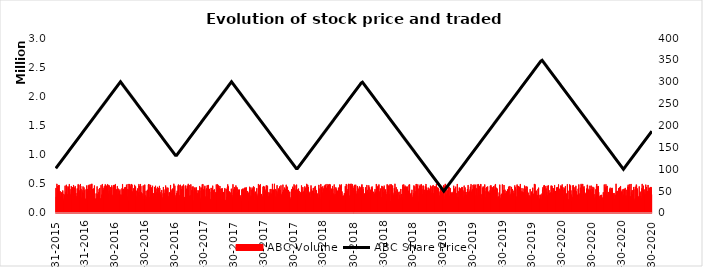
| Category | ABC Volume |
|---|---|
| 2020-12-31 | 293593 |
| 2020-12-30 | 274828 |
| 2020-12-29 | 272429 |
| 2020-12-28 | 317765 |
| 2020-12-27 | 442030 |
| 2020-12-26 | 394762 |
| 2020-12-25 | 220934 |
| 2020-12-24 | 445362 |
| 2020-12-23 | 430547 |
| 2020-12-22 | 373317 |
| 2020-12-21 | 355032 |
| 2020-12-20 | 428271 |
| 2020-12-19 | 380629 |
| 2020-12-18 | 320092 |
| 2020-12-17 | 479339 |
| 2020-12-16 | 374862 |
| 2020-12-15 | 371770 |
| 2020-12-14 | 362038 |
| 2020-12-13 | 247561 |
| 2020-12-12 | 444840 |
| 2020-12-11 | 328514 |
| 2020-12-10 | 485592 |
| 2020-12-09 | 326918 |
| 2020-12-08 | 230145 |
| 2020-12-07 | 350394 |
| 2020-12-06 | 320505 |
| 2020-12-05 | 402558 |
| 2020-12-04 | 400434 |
| 2020-12-03 | 467513 |
| 2020-12-02 | 319006 |
| 2020-12-01 | 408041 |
| 2020-11-30 | 320580 |
| 2020-11-29 | 497994 |
| 2020-11-28 | 423713 |
| 2020-11-27 | 258534 |
| 2020-11-26 | 204472 |
| 2020-11-25 | 286640 |
| 2020-11-24 | 234676 |
| 2020-11-23 | 364799 |
| 2020-11-22 | 340501 |
| 2020-11-21 | 227090 |
| 2020-11-20 | 454773 |
| 2020-11-19 | 287792 |
| 2020-11-18 | 272319 |
| 2020-11-17 | 215284 |
| 2020-11-16 | 248595 |
| 2020-11-15 | 391446 |
| 2020-11-14 | 419872 |
| 2020-11-13 | 347623 |
| 2020-11-12 | 475733 |
| 2020-11-11 | 486680 |
| 2020-11-10 | 225499 |
| 2020-11-09 | 252425 |
| 2020-11-08 | 449818 |
| 2020-11-07 | 245197 |
| 2020-11-06 | 205744 |
| 2020-11-05 | 217034 |
| 2020-11-04 | 402614 |
| 2020-11-03 | 445328 |
| 2020-11-02 | 247998 |
| 2020-11-01 | 388573 |
| 2020-10-31 | 321433 |
| 2020-10-30 | 235897 |
| 2020-10-29 | 390534 |
| 2020-10-28 | 248147 |
| 2020-10-27 | 352326 |
| 2020-10-26 | 497309 |
| 2020-10-25 | 202663 |
| 2020-10-24 | 282266 |
| 2020-10-23 | 284220 |
| 2020-10-22 | 491024 |
| 2020-10-21 | 267436 |
| 2020-10-20 | 387202 |
| 2020-10-19 | 445088 |
| 2020-10-18 | 302125 |
| 2020-10-17 | 483555 |
| 2020-10-16 | 449030 |
| 2020-10-15 | 358519 |
| 2020-10-14 | 261048 |
| 2020-10-13 | 397051 |
| 2020-10-12 | 212842 |
| 2020-10-11 | 298077 |
| 2020-10-10 | 291576 |
| 2020-10-09 | 207609 |
| 2020-10-08 | 429492 |
| 2020-10-07 | 398180 |
| 2020-10-06 | 330576 |
| 2020-10-05 | 402723 |
| 2020-10-04 | 412116 |
| 2020-10-03 | 296934 |
| 2020-10-02 | 315520 |
| 2020-10-01 | 280790 |
| 2020-09-30 | 243458 |
| 2020-09-29 | 402713 |
| 2020-09-28 | 363687 |
| 2020-09-27 | 207209 |
| 2020-09-26 | 367587 |
| 2020-09-25 | 266977 |
| 2020-09-24 | 460219 |
| 2020-09-23 | 220444 |
| 2020-09-22 | 439026 |
| 2020-09-21 | 435786 |
| 2020-09-20 | 418506 |
| 2020-09-19 | 293780 |
| 2020-09-18 | 425760 |
| 2020-09-17 | 281421 |
| 2020-09-16 | 339735 |
| 2020-09-15 | 378714 |
| 2020-09-14 | 213101 |
| 2020-09-13 | 342590 |
| 2020-09-12 | 222878 |
| 2020-09-11 | 368576 |
| 2020-09-10 | 499541 |
| 2020-09-09 | 305060 |
| 2020-09-08 | 240695 |
| 2020-09-07 | 313709 |
| 2020-09-06 | 222005 |
| 2020-09-05 | 244117 |
| 2020-09-04 | 341645 |
| 2020-09-03 | 338054 |
| 2020-09-02 | 272757 |
| 2020-09-01 | 312013 |
| 2020-08-31 | 273923 |
| 2020-08-30 | 387272 |
| 2020-08-29 | 430373 |
| 2020-08-28 | 424963 |
| 2020-08-27 | 237598 |
| 2020-08-26 | 395861 |
| 2020-08-25 | 304533 |
| 2020-08-24 | 353151 |
| 2020-08-23 | 433123 |
| 2020-08-22 | 412750 |
| 2020-08-21 | 353564 |
| 2020-08-20 | 289937 |
| 2020-08-19 | 305488 |
| 2020-08-18 | 354125 |
| 2020-08-17 | 358713 |
| 2020-08-16 | 219059 |
| 2020-08-15 | 299359 |
| 2020-08-14 | 463470 |
| 2020-08-13 | 225856 |
| 2020-08-12 | 335096 |
| 2020-08-11 | 452896 |
| 2020-08-10 | 490731 |
| 2020-08-09 | 380206 |
| 2020-08-08 | 422097 |
| 2020-08-07 | 440602 |
| 2020-08-06 | 279053 |
| 2020-08-05 | 487886 |
| 2020-08-04 | 232232 |
| 2020-08-03 | 278026 |
| 2020-08-02 | 354609 |
| 2020-08-01 | 220355 |
| 2020-07-31 | 247379 |
| 2020-07-30 | 264295 |
| 2020-07-29 | 221296 |
| 2020-07-28 | 308168 |
| 2020-07-27 | 310395 |
| 2020-07-26 | 305130 |
| 2020-07-25 | 297193 |
| 2020-07-24 | 249064 |
| 2020-07-23 | 296013 |
| 2020-07-22 | 243907 |
| 2020-07-21 | 235634 |
| 2020-07-20 | 283247 |
| 2020-07-19 | 357714 |
| 2020-07-18 | 458597 |
| 2020-07-17 | 455423 |
| 2020-07-16 | 330691 |
| 2020-07-15 | 292055 |
| 2020-07-14 | 454823 |
| 2020-07-13 | 496620 |
| 2020-07-12 | 458319 |
| 2020-07-11 | 299392 |
| 2020-07-10 | 405182 |
| 2020-07-09 | 275742 |
| 2020-07-08 | 264995 |
| 2020-07-07 | 248351 |
| 2020-07-06 | 206250 |
| 2020-07-05 | 321291 |
| 2020-07-04 | 435438 |
| 2020-07-03 | 268614 |
| 2020-07-02 | 384959 |
| 2020-07-01 | 448057 |
| 2020-06-30 | 241472 |
| 2020-06-29 | 411460 |
| 2020-06-28 | 322298 |
| 2020-06-27 | 268618 |
| 2020-06-26 | 468176 |
| 2020-06-25 | 364962 |
| 2020-06-24 | 386042 |
| 2020-06-23 | 403868 |
| 2020-06-22 | 465546 |
| 2020-06-21 | 325212 |
| 2020-06-20 | 387564 |
| 2020-06-19 | 396195 |
| 2020-06-18 | 262077 |
| 2020-06-17 | 394744 |
| 2020-06-16 | 416019 |
| 2020-06-15 | 472125 |
| 2020-06-14 | 482319 |
| 2020-06-13 | 371648 |
| 2020-06-12 | 417693 |
| 2020-06-11 | 293828 |
| 2020-06-10 | 347341 |
| 2020-06-09 | 328677 |
| 2020-06-08 | 276267 |
| 2020-06-07 | 219418 |
| 2020-06-06 | 302438 |
| 2020-06-05 | 408557 |
| 2020-06-04 | 457717 |
| 2020-06-03 | 439293 |
| 2020-06-02 | 443428 |
| 2020-06-01 | 315535 |
| 2020-05-31 | 497722 |
| 2020-05-30 | 266016 |
| 2020-05-29 | 295369 |
| 2020-05-28 | 275805 |
| 2020-05-27 | 479265 |
| 2020-05-26 | 498565 |
| 2020-05-25 | 392603 |
| 2020-05-24 | 433113 |
| 2020-05-23 | 340204 |
| 2020-05-22 | 321420 |
| 2020-05-21 | 237299 |
| 2020-05-20 | 228883 |
| 2020-05-19 | 488584 |
| 2020-05-18 | 429200 |
| 2020-05-17 | 412673 |
| 2020-05-16 | 292912 |
| 2020-05-15 | 312720 |
| 2020-05-14 | 253837 |
| 2020-05-13 | 290539 |
| 2020-05-12 | 353909 |
| 2020-05-11 | 375604 |
| 2020-05-10 | 465164 |
| 2020-05-09 | 353156 |
| 2020-05-08 | 401326 |
| 2020-05-07 | 441034 |
| 2020-05-06 | 387944 |
| 2020-05-05 | 227071 |
| 2020-05-04 | 373667 |
| 2020-05-03 | 436260 |
| 2020-05-02 | 475428 |
| 2020-05-01 | 471126 |
| 2020-04-30 | 267703 |
| 2020-04-29 | 206551 |
| 2020-04-28 | 278298 |
| 2020-04-27 | 216684 |
| 2020-04-26 | 315089 |
| 2020-04-25 | 386591 |
| 2020-04-24 | 470329 |
| 2020-04-23 | 219808 |
| 2020-04-22 | 417544 |
| 2020-04-21 | 490041 |
| 2020-04-20 | 208571 |
| 2020-04-19 | 220179 |
| 2020-04-18 | 227873 |
| 2020-04-17 | 230576 |
| 2020-04-16 | 378062 |
| 2020-04-15 | 386934 |
| 2020-04-14 | 491922 |
| 2020-04-13 | 239001 |
| 2020-04-12 | 256068 |
| 2020-04-11 | 331203 |
| 2020-04-10 | 256195 |
| 2020-04-09 | 342380 |
| 2020-04-08 | 460254 |
| 2020-04-07 | 249301 |
| 2020-04-06 | 256168 |
| 2020-04-05 | 409473 |
| 2020-04-04 | 432671 |
| 2020-04-03 | 313710 |
| 2020-04-02 | 295084 |
| 2020-04-01 | 394463 |
| 2020-03-31 | 445649 |
| 2020-03-30 | 203758 |
| 2020-03-29 | 488651 |
| 2020-03-28 | 402739 |
| 2020-03-27 | 455798 |
| 2020-03-26 | 380469 |
| 2020-03-25 | 469878 |
| 2020-03-24 | 289388 |
| 2020-03-23 | 401411 |
| 2020-03-22 | 259962 |
| 2020-03-21 | 339320 |
| 2020-03-20 | 415547 |
| 2020-03-19 | 405031 |
| 2020-03-18 | 489746 |
| 2020-03-17 | 255947 |
| 2020-03-16 | 338959 |
| 2020-03-15 | 443164 |
| 2020-03-14 | 421887 |
| 2020-03-13 | 414864 |
| 2020-03-12 | 437793 |
| 2020-03-11 | 285787 |
| 2020-03-10 | 240993 |
| 2020-03-09 | 376391 |
| 2020-03-08 | 233462 |
| 2020-03-07 | 359167 |
| 2020-03-06 | 478087 |
| 2020-03-05 | 425589 |
| 2020-03-04 | 349460 |
| 2020-03-03 | 413250 |
| 2020-03-02 | 231729 |
| 2020-03-01 | 428373 |
| 2020-02-29 | 337169 |
| 2020-02-28 | 206803 |
| 2020-02-27 | 462768 |
| 2020-02-26 | 466145 |
| 2020-02-25 | 355580 |
| 2020-02-24 | 467655 |
| 2020-02-23 | 350634 |
| 2020-02-22 | 246526 |
| 2020-02-21 | 249093 |
| 2020-02-20 | 265206 |
| 2020-02-19 | 342492 |
| 2020-02-18 | 389714 |
| 2020-02-17 | 305522 |
| 2020-02-16 | 472887 |
| 2020-02-15 | 206792 |
| 2020-02-14 | 287423 |
| 2020-02-13 | 307143 |
| 2020-02-12 | 465738 |
| 2020-02-11 | 365464 |
| 2020-02-10 | 261693 |
| 2020-02-09 | 418950 |
| 2020-02-08 | 285106 |
| 2020-02-07 | 247152 |
| 2020-02-06 | 459133 |
| 2020-02-05 | 405224 |
| 2020-02-04 | 475279 |
| 2020-02-03 | 263403 |
| 2020-02-02 | 470840 |
| 2020-02-01 | 346785 |
| 2020-01-31 | 349708 |
| 2020-01-30 | 439856 |
| 2020-01-29 | 399170 |
| 2020-01-28 | 261869 |
| 2020-01-27 | 330424 |
| 2020-01-26 | 223862 |
| 2020-01-25 | 238451 |
| 2020-01-24 | 305119 |
| 2020-01-23 | 283020 |
| 2020-01-22 | 313134 |
| 2020-01-21 | 206033 |
| 2020-01-20 | 246868 |
| 2020-01-19 | 225529 |
| 2020-01-18 | 309701 |
| 2020-01-17 | 433755 |
| 2020-01-16 | 290473 |
| 2020-01-15 | 412385 |
| 2020-01-14 | 215404 |
| 2020-01-13 | 306996 |
| 2020-01-12 | 249900 |
| 2020-01-11 | 268503 |
| 2020-01-10 | 381808 |
| 2020-01-09 | 254371 |
| 2020-01-08 | 355115 |
| 2020-01-07 | 370761 |
| 2020-01-06 | 491108 |
| 2020-01-05 | 477795 |
| 2020-01-04 | 497795 |
| 2020-01-03 | 207787 |
| 2020-01-02 | 330719 |
| 2020-01-01 | 318164 |
| 2019-12-31 | 287178 |
| 2019-12-30 | 432228 |
| 2019-12-29 | 326002 |
| 2019-12-28 | 218760 |
| 2019-12-27 | 368318 |
| 2019-12-26 | 353245 |
| 2019-12-25 | 264251 |
| 2019-12-24 | 204759 |
| 2019-12-23 | 277120 |
| 2019-12-22 | 408765 |
| 2019-12-21 | 299182 |
| 2019-12-20 | 231085 |
| 2019-12-19 | 210006 |
| 2019-12-18 | 301881 |
| 2019-12-17 | 235604 |
| 2019-12-16 | 347216 |
| 2019-12-15 | 262704 |
| 2019-12-14 | 367011 |
| 2019-12-13 | 448667 |
| 2019-12-12 | 250621 |
| 2019-12-11 | 264907 |
| 2019-12-10 | 456550 |
| 2019-12-09 | 317460 |
| 2019-12-08 | 216646 |
| 2019-12-07 | 408963 |
| 2019-12-06 | 452602 |
| 2019-12-05 | 469369 |
| 2019-12-04 | 266080 |
| 2019-12-03 | 418747 |
| 2019-12-02 | 345901 |
| 2019-12-01 | 285225 |
| 2019-11-30 | 359220 |
| 2019-11-29 | 364314 |
| 2019-11-28 | 297111 |
| 2019-11-27 | 426093 |
| 2019-11-26 | 351508 |
| 2019-11-25 | 300036 |
| 2019-11-24 | 374581 |
| 2019-11-23 | 381718 |
| 2019-11-22 | 496688 |
| 2019-11-21 | 410346 |
| 2019-11-20 | 445636 |
| 2019-11-19 | 432231 |
| 2019-11-18 | 213714 |
| 2019-11-17 | 461652 |
| 2019-11-16 | 364691 |
| 2019-11-15 | 315931 |
| 2019-11-14 | 360990 |
| 2019-11-13 | 465518 |
| 2019-11-12 | 486931 |
| 2019-11-11 | 255876 |
| 2019-11-10 | 281467 |
| 2019-11-09 | 211407 |
| 2019-11-08 | 406537 |
| 2019-11-07 | 438938 |
| 2019-11-06 | 229513 |
| 2019-11-05 | 472318 |
| 2019-11-04 | 234152 |
| 2019-11-03 | 337296 |
| 2019-11-02 | 336996 |
| 2019-11-01 | 244472 |
| 2019-10-31 | 380465 |
| 2019-10-30 | 257850 |
| 2019-10-29 | 410434 |
| 2019-10-28 | 308746 |
| 2019-10-27 | 246796 |
| 2019-10-26 | 446588 |
| 2019-10-25 | 352332 |
| 2019-10-24 | 261592 |
| 2019-10-23 | 263454 |
| 2019-10-22 | 321075 |
| 2019-10-21 | 459544 |
| 2019-10-20 | 298502 |
| 2019-10-19 | 276926 |
| 2019-10-18 | 452240 |
| 2019-10-17 | 438103 |
| 2019-10-16 | 332799 |
| 2019-10-15 | 281191 |
| 2019-10-14 | 404177 |
| 2019-10-13 | 338552 |
| 2019-10-12 | 349692 |
| 2019-10-11 | 218149 |
| 2019-10-10 | 373898 |
| 2019-10-09 | 285788 |
| 2019-10-08 | 269194 |
| 2019-10-07 | 336955 |
| 2019-10-06 | 397816 |
| 2019-10-05 | 256834 |
| 2019-10-04 | 334293 |
| 2019-10-03 | 479255 |
| 2019-10-02 | 394780 |
| 2019-10-01 | 352659 |
| 2019-09-30 | 372746 |
| 2019-09-29 | 280992 |
| 2019-09-28 | 489396 |
| 2019-09-27 | 246763 |
| 2019-09-26 | 233546 |
| 2019-09-25 | 329069 |
| 2019-09-24 | 309861 |
| 2019-09-23 | 260192 |
| 2019-09-22 | 205601 |
| 2019-09-21 | 242770 |
| 2019-09-20 | 484983 |
| 2019-09-19 | 234201 |
| 2019-09-18 | 352139 |
| 2019-09-17 | 269185 |
| 2019-09-16 | 282274 |
| 2019-09-15 | 237720 |
| 2019-09-14 | 266952 |
| 2019-09-13 | 205376 |
| 2019-09-12 | 416729 |
| 2019-09-11 | 415270 |
| 2019-09-10 | 432287 |
| 2019-09-09 | 394179 |
| 2019-09-08 | 304804 |
| 2019-09-07 | 494476 |
| 2019-09-06 | 483041 |
| 2019-09-05 | 245591 |
| 2019-09-04 | 400951 |
| 2019-09-03 | 247432 |
| 2019-09-02 | 454425 |
| 2019-09-01 | 456895 |
| 2019-08-31 | 444321 |
| 2019-08-30 | 299961 |
| 2019-08-29 | 426385 |
| 2019-08-28 | 390067 |
| 2019-08-27 | 446510 |
| 2019-08-26 | 255302 |
| 2019-08-25 | 378103 |
| 2019-08-24 | 473774 |
| 2019-08-23 | 464098 |
| 2019-08-22 | 465738 |
| 2019-08-21 | 386546 |
| 2019-08-20 | 223882 |
| 2019-08-19 | 345522 |
| 2019-08-18 | 263370 |
| 2019-08-17 | 365986 |
| 2019-08-16 | 219725 |
| 2019-08-15 | 283839 |
| 2019-08-14 | 454404 |
| 2019-08-13 | 390087 |
| 2019-08-12 | 444226 |
| 2019-08-11 | 440852 |
| 2019-08-10 | 304145 |
| 2019-08-09 | 425629 |
| 2019-08-08 | 230443 |
| 2019-08-07 | 273819 |
| 2019-08-06 | 373314 |
| 2019-08-05 | 488788 |
| 2019-08-04 | 236920 |
| 2019-08-03 | 393827 |
| 2019-08-02 | 246340 |
| 2019-08-01 | 440286 |
| 2019-07-31 | 454555 |
| 2019-07-30 | 271494 |
| 2019-07-29 | 432124 |
| 2019-07-28 | 307263 |
| 2019-07-27 | 257446 |
| 2019-07-26 | 200451 |
| 2019-07-25 | 322186 |
| 2019-07-24 | 495066 |
| 2019-07-23 | 488980 |
| 2019-07-22 | 245056 |
| 2019-07-21 | 463775 |
| 2019-07-20 | 297644 |
| 2019-07-19 | 458371 |
| 2019-07-18 | 357399 |
| 2019-07-17 | 492000 |
| 2019-07-16 | 347686 |
| 2019-07-15 | 288225 |
| 2019-07-14 | 296423 |
| 2019-07-13 | 489716 |
| 2019-07-12 | 406558 |
| 2019-07-11 | 319024 |
| 2019-07-10 | 424584 |
| 2019-07-09 | 294834 |
| 2019-07-08 | 283494 |
| 2019-07-07 | 484649 |
| 2019-07-06 | 312455 |
| 2019-07-05 | 461135 |
| 2019-07-04 | 385653 |
| 2019-07-03 | 487847 |
| 2019-07-02 | 447595 |
| 2019-07-01 | 235443 |
| 2019-06-30 | 479248 |
| 2019-06-29 | 409215 |
| 2019-06-28 | 268278 |
| 2019-06-27 | 387872 |
| 2019-06-26 | 246612 |
| 2019-06-25 | 360382 |
| 2019-06-24 | 493588 |
| 2019-06-23 | 239122 |
| 2019-06-22 | 449750 |
| 2019-06-21 | 402600 |
| 2019-06-20 | 331241 |
| 2019-06-19 | 368434 |
| 2019-06-18 | 329185 |
| 2019-06-17 | 250130 |
| 2019-06-16 | 357271 |
| 2019-06-15 | 478018 |
| 2019-06-14 | 210821 |
| 2019-06-13 | 411227 |
| 2019-06-12 | 302300 |
| 2019-06-11 | 298395 |
| 2019-06-10 | 306432 |
| 2019-06-09 | 359926 |
| 2019-06-08 | 330033 |
| 2019-06-07 | 359954 |
| 2019-06-06 | 435916 |
| 2019-06-05 | 299933 |
| 2019-06-04 | 267964 |
| 2019-06-03 | 468015 |
| 2019-06-02 | 366814 |
| 2019-06-01 | 234499 |
| 2019-05-31 | 268969 |
| 2019-05-30 | 391246 |
| 2019-05-29 | 282771 |
| 2019-05-28 | 439940 |
| 2019-05-27 | 443404 |
| 2019-05-26 | 429911 |
| 2019-05-25 | 250986 |
| 2019-05-24 | 333785 |
| 2019-05-23 | 414786 |
| 2019-05-22 | 221018 |
| 2019-05-21 | 424251 |
| 2019-05-20 | 228068 |
| 2019-05-19 | 436024 |
| 2019-05-18 | 222083 |
| 2019-05-17 | 275167 |
| 2019-05-16 | 373182 |
| 2019-05-15 | 205310 |
| 2019-05-14 | 266604 |
| 2019-05-13 | 496989 |
| 2019-05-12 | 279719 |
| 2019-05-11 | 266569 |
| 2019-05-10 | 339848 |
| 2019-05-09 | 223405 |
| 2019-05-08 | 449520 |
| 2019-05-07 | 391733 |
| 2019-05-06 | 270613 |
| 2019-05-05 | 417273 |
| 2019-05-04 | 246243 |
| 2019-05-03 | 410997 |
| 2019-05-02 | 466271 |
| 2019-05-01 | 372480 |
| 2019-04-30 | 338083 |
| 2019-04-29 | 317692 |
| 2019-04-28 | 351296 |
| 2019-04-27 | 310848 |
| 2019-04-26 | 303095 |
| 2019-04-25 | 331928 |
| 2019-04-24 | 353867 |
| 2019-04-23 | 219779 |
| 2019-04-22 | 419163 |
| 2019-04-21 | 426164 |
| 2019-04-20 | 295486 |
| 2019-04-19 | 243812 |
| 2019-04-18 | 447750 |
| 2019-04-17 | 228292 |
| 2019-04-16 | 442234 |
| 2019-04-15 | 470742 |
| 2019-04-14 | 300400 |
| 2019-04-13 | 385440 |
| 2019-04-12 | 333486 |
| 2019-04-11 | 317717 |
| 2019-04-10 | 216967 |
| 2019-04-09 | 467804 |
| 2019-04-08 | 327647 |
| 2019-04-07 | 487395 |
| 2019-04-06 | 498853 |
| 2019-04-05 | 465268 |
| 2019-04-04 | 231519 |
| 2019-04-03 | 235211 |
| 2019-04-02 | 299823 |
| 2019-04-01 | 475317 |
| 2019-03-31 | 397372 |
| 2019-03-30 | 223529 |
| 2019-03-29 | 326658 |
| 2019-03-28 | 422583 |
| 2019-03-27 | 297946 |
| 2019-03-26 | 357625 |
| 2019-03-25 | 370460 |
| 2019-03-24 | 445152 |
| 2019-03-23 | 413318 |
| 2019-03-22 | 416176 |
| 2019-03-21 | 262520 |
| 2019-03-20 | 300649 |
| 2019-03-19 | 201476 |
| 2019-03-18 | 366704 |
| 2019-03-17 | 346999 |
| 2019-03-16 | 422516 |
| 2019-03-15 | 356115 |
| 2019-03-14 | 439147 |
| 2019-03-13 | 425631 |
| 2019-03-12 | 259859 |
| 2019-03-11 | 334175 |
| 2019-03-10 | 497215 |
| 2019-03-09 | 344479 |
| 2019-03-08 | 254326 |
| 2019-03-07 | 450545 |
| 2019-03-06 | 453935 |
| 2019-03-05 | 351332 |
| 2019-03-04 | 455197 |
| 2019-03-03 | 282541 |
| 2019-03-02 | 326895 |
| 2019-03-01 | 337248 |
| 2019-02-28 | 477365 |
| 2019-02-27 | 221103 |
| 2019-02-26 | 464104 |
| 2019-02-25 | 413858 |
| 2019-02-24 | 346568 |
| 2019-02-23 | 338284 |
| 2019-02-22 | 452078 |
| 2019-02-21 | 343850 |
| 2019-02-20 | 468678 |
| 2019-02-19 | 258569 |
| 2019-02-18 | 264617 |
| 2019-02-17 | 380388 |
| 2019-02-16 | 417593 |
| 2019-02-15 | 358586 |
| 2019-02-14 | 387382 |
| 2019-02-13 | 433453 |
| 2019-02-12 | 335294 |
| 2019-02-11 | 388087 |
| 2019-02-10 | 318335 |
| 2019-02-09 | 210001 |
| 2019-02-08 | 437928 |
| 2019-02-07 | 285977 |
| 2019-02-06 | 495613 |
| 2019-02-05 | 315150 |
| 2019-02-04 | 458359 |
| 2019-02-03 | 327397 |
| 2019-02-02 | 353381 |
| 2019-02-01 | 397047 |
| 2019-01-31 | 277913 |
| 2019-01-30 | 382678 |
| 2019-01-29 | 465819 |
| 2019-01-28 | 467475 |
| 2019-01-27 | 323993 |
| 2019-01-26 | 279867 |
| 2019-01-25 | 402423 |
| 2019-01-24 | 413255 |
| 2019-01-23 | 492424 |
| 2019-01-22 | 456996 |
| 2019-01-21 | 442212 |
| 2019-01-20 | 372765 |
| 2019-01-19 | 485674 |
| 2019-01-18 | 459648 |
| 2019-01-17 | 345407 |
| 2019-01-16 | 207390 |
| 2019-01-15 | 417680 |
| 2019-01-14 | 200825 |
| 2019-01-13 | 296285 |
| 2019-01-12 | 490082 |
| 2019-01-11 | 278569 |
| 2019-01-10 | 454914 |
| 2019-01-09 | 325520 |
| 2019-01-08 | 490482 |
| 2019-01-07 | 496390 |
| 2019-01-06 | 350547 |
| 2019-01-05 | 246892 |
| 2019-01-04 | 373730 |
| 2019-01-03 | 455649 |
| 2019-01-02 | 308410 |
| 2019-01-01 | 325487 |
| 2018-12-31 | 471675 |
| 2018-12-30 | 339557 |
| 2018-12-29 | 301766 |
| 2018-12-28 | 238685 |
| 2018-12-27 | 269349 |
| 2018-12-26 | 269222 |
| 2018-12-25 | 396753 |
| 2018-12-24 | 230503 |
| 2018-12-23 | 345515 |
| 2018-12-22 | 253059 |
| 2018-12-21 | 294510 |
| 2018-12-20 | 316780 |
| 2018-12-19 | 335282 |
| 2018-12-18 | 489353 |
| 2018-12-17 | 206592 |
| 2018-12-16 | 483376 |
| 2018-12-15 | 380979 |
| 2018-12-14 | 363356 |
| 2018-12-13 | 308385 |
| 2018-12-12 | 216216 |
| 2018-12-11 | 451424 |
| 2018-12-10 | 413289 |
| 2018-12-09 | 450267 |
| 2018-12-08 | 444635 |
| 2018-12-07 | 371406 |
| 2018-12-06 | 337377 |
| 2018-12-05 | 447877 |
| 2018-12-04 | 469100 |
| 2018-12-03 | 444906 |
| 2018-12-02 | 228068 |
| 2018-12-01 | 222412 |
| 2018-11-30 | 488888 |
| 2018-11-29 | 228528 |
| 2018-11-28 | 442264 |
| 2018-11-27 | 482814 |
| 2018-11-26 | 228112 |
| 2018-11-25 | 273640 |
| 2018-11-24 | 231749 |
| 2018-11-23 | 325707 |
| 2018-11-22 | 250440 |
| 2018-11-21 | 411386 |
| 2018-11-20 | 253563 |
| 2018-11-19 | 267171 |
| 2018-11-18 | 310663 |
| 2018-11-17 | 250184 |
| 2018-11-16 | 363670 |
| 2018-11-15 | 234983 |
| 2018-11-14 | 222710 |
| 2018-11-13 | 353678 |
| 2018-11-12 | 235480 |
| 2018-11-11 | 386404 |
| 2018-11-10 | 404563 |
| 2018-11-09 | 202964 |
| 2018-11-08 | 322987 |
| 2018-11-07 | 441119 |
| 2018-11-06 | 302231 |
| 2018-11-05 | 243312 |
| 2018-11-04 | 370871 |
| 2018-11-03 | 499573 |
| 2018-11-02 | 235045 |
| 2018-11-01 | 425475 |
| 2018-10-31 | 317224 |
| 2018-10-30 | 299996 |
| 2018-10-29 | 247711 |
| 2018-10-28 | 346812 |
| 2018-10-27 | 471606 |
| 2018-10-26 | 234325 |
| 2018-10-25 | 457423 |
| 2018-10-24 | 307307 |
| 2018-10-23 | 490219 |
| 2018-10-22 | 469185 |
| 2018-10-21 | 203167 |
| 2018-10-20 | 203742 |
| 2018-10-19 | 493114 |
| 2018-10-18 | 326822 |
| 2018-10-17 | 312010 |
| 2018-10-16 | 470904 |
| 2018-10-15 | 459390 |
| 2018-10-14 | 452216 |
| 2018-10-13 | 211910 |
| 2018-10-12 | 482181 |
| 2018-10-11 | 413358 |
| 2018-10-10 | 490193 |
| 2018-10-09 | 323477 |
| 2018-10-08 | 219306 |
| 2018-10-07 | 252572 |
| 2018-10-06 | 365166 |
| 2018-10-05 | 404236 |
| 2018-10-04 | 330609 |
| 2018-10-03 | 341682 |
| 2018-10-02 | 371888 |
| 2018-10-01 | 468081 |
| 2018-09-30 | 438408 |
| 2018-09-29 | 209663 |
| 2018-09-28 | 358639 |
| 2018-09-27 | 243348 |
| 2018-09-26 | 396688 |
| 2018-09-25 | 452672 |
| 2018-09-24 | 464190 |
| 2018-09-23 | 270814 |
| 2018-09-22 | 265722 |
| 2018-09-21 | 265293 |
| 2018-09-20 | 419236 |
| 2018-09-19 | 326073 |
| 2018-09-18 | 355023 |
| 2018-09-17 | 215530 |
| 2018-09-16 | 367637 |
| 2018-09-15 | 487914 |
| 2018-09-14 | 440255 |
| 2018-09-13 | 464939 |
| 2018-09-12 | 229080 |
| 2018-09-11 | 452805 |
| 2018-09-10 | 337758 |
| 2018-09-09 | 340329 |
| 2018-09-08 | 485747 |
| 2018-09-07 | 495875 |
| 2018-09-06 | 283769 |
| 2018-09-05 | 363141 |
| 2018-09-04 | 220487 |
| 2018-09-03 | 409059 |
| 2018-09-02 | 334633 |
| 2018-09-01 | 202002 |
| 2018-08-31 | 291449 |
| 2018-08-30 | 363390 |
| 2018-08-29 | 323588 |
| 2018-08-28 | 294947 |
| 2018-08-27 | 284173 |
| 2018-08-26 | 427360 |
| 2018-08-25 | 454547 |
| 2018-08-24 | 370359 |
| 2018-08-23 | 441854 |
| 2018-08-22 | 297832 |
| 2018-08-21 | 281631 |
| 2018-08-20 | 398353 |
| 2018-08-19 | 209831 |
| 2018-08-18 | 352463 |
| 2018-08-17 | 251221 |
| 2018-08-16 | 437853 |
| 2018-08-15 | 473497 |
| 2018-08-14 | 310134 |
| 2018-08-13 | 357336 |
| 2018-08-12 | 326389 |
| 2018-08-11 | 395826 |
| 2018-08-10 | 367803 |
| 2018-08-09 | 479011 |
| 2018-08-08 | 354102 |
| 2018-08-07 | 380582 |
| 2018-08-06 | 310021 |
| 2018-08-05 | 440002 |
| 2018-08-04 | 323285 |
| 2018-08-03 | 305385 |
| 2018-08-02 | 334434 |
| 2018-08-01 | 245103 |
| 2018-07-31 | 231088 |
| 2018-07-30 | 296464 |
| 2018-07-29 | 405700 |
| 2018-07-28 | 444229 |
| 2018-07-27 | 378856 |
| 2018-07-26 | 363698 |
| 2018-07-25 | 490682 |
| 2018-07-24 | 473969 |
| 2018-07-23 | 435422 |
| 2018-07-22 | 378575 |
| 2018-07-21 | 313479 |
| 2018-07-20 | 437565 |
| 2018-07-19 | 244150 |
| 2018-07-18 | 456422 |
| 2018-07-17 | 232153 |
| 2018-07-16 | 273442 |
| 2018-07-15 | 329169 |
| 2018-07-14 | 417240 |
| 2018-07-13 | 328154 |
| 2018-07-12 | 448810 |
| 2018-07-11 | 462379 |
| 2018-07-10 | 373043 |
| 2018-07-09 | 330976 |
| 2018-07-08 | 317729 |
| 2018-07-07 | 302533 |
| 2018-07-06 | 483898 |
| 2018-07-05 | 408023 |
| 2018-07-04 | 327215 |
| 2018-07-03 | 406419 |
| 2018-07-02 | 482112 |
| 2018-07-01 | 459639 |
| 2018-06-30 | 429413 |
| 2018-06-29 | 369374 |
| 2018-06-28 | 383449 |
| 2018-06-27 | 373267 |
| 2018-06-26 | 491671 |
| 2018-06-25 | 231612 |
| 2018-06-24 | 438207 |
| 2018-06-23 | 459098 |
| 2018-06-22 | 499662 |
| 2018-06-21 | 453505 |
| 2018-06-20 | 423183 |
| 2018-06-19 | 498124 |
| 2018-06-18 | 299604 |
| 2018-06-17 | 223001 |
| 2018-06-16 | 257948 |
| 2018-06-15 | 499162 |
| 2018-06-14 | 495928 |
| 2018-06-13 | 486142 |
| 2018-06-12 | 409425 |
| 2018-06-11 | 372631 |
| 2018-06-10 | 288652 |
| 2018-06-09 | 204100 |
| 2018-06-08 | 371919 |
| 2018-06-07 | 496745 |
| 2018-06-06 | 298451 |
| 2018-06-05 | 432589 |
| 2018-06-04 | 459440 |
| 2018-06-03 | 320417 |
| 2018-06-02 | 319591 |
| 2018-06-01 | 338600 |
| 2018-05-31 | 232838 |
| 2018-05-30 | 297645 |
| 2018-05-29 | 252046 |
| 2018-05-28 | 292986 |
| 2018-05-27 | 213867 |
| 2018-05-26 | 285745 |
| 2018-05-25 | 367202 |
| 2018-05-24 | 326184 |
| 2018-05-23 | 488820 |
| 2018-05-22 | 304301 |
| 2018-05-21 | 297907 |
| 2018-05-20 | 469506 |
| 2018-05-19 | 218036 |
| 2018-05-18 | 486484 |
| 2018-05-17 | 430888 |
| 2018-05-16 | 324129 |
| 2018-05-15 | 292294 |
| 2018-05-14 | 434252 |
| 2018-05-13 | 204535 |
| 2018-05-12 | 342372 |
| 2018-05-11 | 382730 |
| 2018-05-10 | 201624 |
| 2018-05-09 | 291869 |
| 2018-05-08 | 415915 |
| 2018-05-07 | 294266 |
| 2018-05-06 | 440600 |
| 2018-05-05 | 221526 |
| 2018-05-04 | 325817 |
| 2018-05-03 | 295757 |
| 2018-05-02 | 276368 |
| 2018-05-01 | 488136 |
| 2018-04-30 | 315102 |
| 2018-04-29 | 215615 |
| 2018-04-28 | 335232 |
| 2018-04-27 | 413683 |
| 2018-04-26 | 461964 |
| 2018-04-25 | 218469 |
| 2018-04-24 | 377726 |
| 2018-04-23 | 416384 |
| 2018-04-22 | 205618 |
| 2018-04-21 | 308376 |
| 2018-04-20 | 281107 |
| 2018-04-19 | 487387 |
| 2018-04-18 | 388979 |
| 2018-04-17 | 225713 |
| 2018-04-16 | 494282 |
| 2018-04-15 | 376271 |
| 2018-04-14 | 486258 |
| 2018-04-13 | 262230 |
| 2018-04-12 | 206897 |
| 2018-04-11 | 465064 |
| 2018-04-10 | 266931 |
| 2018-04-09 | 496165 |
| 2018-04-08 | 348594 |
| 2018-04-07 | 423192 |
| 2018-04-06 | 433567 |
| 2018-04-05 | 408243 |
| 2018-04-04 | 486921 |
| 2018-04-03 | 460770 |
| 2018-04-02 | 348818 |
| 2018-04-01 | 469018 |
| 2018-03-31 | 287009 |
| 2018-03-30 | 368589 |
| 2018-03-29 | 420492 |
| 2018-03-28 | 217693 |
| 2018-03-27 | 456313 |
| 2018-03-26 | 351416 |
| 2018-03-25 | 351426 |
| 2018-03-24 | 231799 |
| 2018-03-23 | 441827 |
| 2018-03-22 | 411953 |
| 2018-03-21 | 494899 |
| 2018-03-20 | 212492 |
| 2018-03-19 | 241834 |
| 2018-03-18 | 276056 |
| 2018-03-17 | 316555 |
| 2018-03-16 | 417424 |
| 2018-03-15 | 481291 |
| 2018-03-14 | 202095 |
| 2018-03-13 | 263688 |
| 2018-03-12 | 258561 |
| 2018-03-11 | 322304 |
| 2018-03-10 | 299285 |
| 2018-03-09 | 343391 |
| 2018-03-08 | 389714 |
| 2018-03-07 | 363547 |
| 2018-03-06 | 202593 |
| 2018-03-05 | 424883 |
| 2018-03-04 | 462947 |
| 2018-03-03 | 445970 |
| 2018-03-02 | 267562 |
| 2018-03-01 | 337742 |
| 2018-02-28 | 251756 |
| 2018-02-27 | 380132 |
| 2018-02-26 | 429623 |
| 2018-02-25 | 315706 |
| 2018-02-24 | 380816 |
| 2018-02-23 | 320856 |
| 2018-02-22 | 368976 |
| 2018-02-21 | 208468 |
| 2018-02-20 | 407359 |
| 2018-02-19 | 471933 |
| 2018-02-18 | 268334 |
| 2018-02-17 | 248047 |
| 2018-02-16 | 364876 |
| 2018-02-15 | 331506 |
| 2018-02-14 | 325935 |
| 2018-02-13 | 347106 |
| 2018-02-12 | 241070 |
| 2018-02-11 | 444983 |
| 2018-02-10 | 202739 |
| 2018-02-09 | 481802 |
| 2018-02-08 | 434447 |
| 2018-02-07 | 343384 |
| 2018-02-06 | 499009 |
| 2018-02-05 | 324073 |
| 2018-02-04 | 298148 |
| 2018-02-03 | 432798 |
| 2018-02-02 | 243015 |
| 2018-02-01 | 352735 |
| 2018-01-31 | 455465 |
| 2018-01-30 | 403560 |
| 2018-01-29 | 344462 |
| 2018-01-28 | 251907 |
| 2018-01-27 | 366472 |
| 2018-01-26 | 229643 |
| 2018-01-25 | 442519 |
| 2018-01-24 | 212992 |
| 2018-01-23 | 356926 |
| 2018-01-22 | 207982 |
| 2018-01-21 | 472088 |
| 2018-01-20 | 284560 |
| 2018-01-19 | 360517 |
| 2018-01-18 | 336036 |
| 2018-01-17 | 223974 |
| 2018-01-16 | 305347 |
| 2018-01-15 | 236095 |
| 2018-01-14 | 377190 |
| 2018-01-13 | 349081 |
| 2018-01-12 | 417851 |
| 2018-01-11 | 407712 |
| 2018-01-10 | 259326 |
| 2018-01-09 | 324950 |
| 2018-01-08 | 392254 |
| 2018-01-07 | 404269 |
| 2018-01-06 | 485527 |
| 2018-01-05 | 400390 |
| 2018-01-04 | 372455 |
| 2018-01-03 | 333809 |
| 2018-01-02 | 396007 |
| 2018-01-01 | 472305 |
| 2017-12-31 | 355978 |
| 2017-12-30 | 368679 |
| 2017-12-29 | 490558 |
| 2017-12-28 | 427577 |
| 2017-12-27 | 241778 |
| 2017-12-26 | 203510 |
| 2017-12-25 | 449605 |
| 2017-12-24 | 386724 |
| 2017-12-23 | 306884 |
| 2017-12-22 | 410427 |
| 2017-12-21 | 384306 |
| 2017-12-20 | 273239 |
| 2017-12-19 | 246586 |
| 2017-12-18 | 234720 |
| 2017-12-17 | 224735 |
| 2017-12-16 | 362066 |
| 2017-12-15 | 304604 |
| 2017-12-14 | 201494 |
| 2017-12-13 | 370528 |
| 2017-12-12 | 393913 |
| 2017-12-11 | 296371 |
| 2017-12-10 | 342669 |
| 2017-12-09 | 449449 |
| 2017-12-08 | 424666 |
| 2017-12-07 | 375108 |
| 2017-12-06 | 457563 |
| 2017-12-05 | 482945 |
| 2017-12-04 | 414419 |
| 2017-12-03 | 386418 |
| 2017-12-02 | 360196 |
| 2017-12-01 | 270738 |
| 2017-11-30 | 435177 |
| 2017-11-29 | 228411 |
| 2017-11-28 | 294569 |
| 2017-11-27 | 396331 |
| 2017-11-26 | 216222 |
| 2017-11-25 | 485354 |
| 2017-11-24 | 360847 |
| 2017-11-23 | 332081 |
| 2017-11-22 | 299554 |
| 2017-11-21 | 314703 |
| 2017-11-20 | 232877 |
| 2017-11-19 | 473220 |
| 2017-11-18 | 329589 |
| 2017-11-17 | 395290 |
| 2017-11-16 | 280951 |
| 2017-11-15 | 454363 |
| 2017-11-14 | 412113 |
| 2017-11-13 | 304269 |
| 2017-11-12 | 419598 |
| 2017-11-11 | 388922 |
| 2017-11-10 | 356959 |
| 2017-11-09 | 317266 |
| 2017-11-08 | 327063 |
| 2017-11-07 | 475427 |
| 2017-11-06 | 381868 |
| 2017-11-05 | 271303 |
| 2017-11-04 | 225976 |
| 2017-11-03 | 408919 |
| 2017-11-02 | 269901 |
| 2017-11-01 | 283360 |
| 2017-10-31 | 304925 |
| 2017-10-30 | 499694 |
| 2017-10-29 | 351637 |
| 2017-10-28 | 215262 |
| 2017-10-27 | 399928 |
| 2017-10-26 | 206050 |
| 2017-10-25 | 258740 |
| 2017-10-24 | 498961 |
| 2017-10-23 | 204337 |
| 2017-10-22 | 219715 |
| 2017-10-21 | 330790 |
| 2017-10-20 | 407676 |
| 2017-10-19 | 226516 |
| 2017-10-18 | 309574 |
| 2017-10-17 | 411117 |
| 2017-10-16 | 350964 |
| 2017-10-15 | 313878 |
| 2017-10-14 | 287222 |
| 2017-10-13 | 287702 |
| 2017-10-12 | 208623 |
| 2017-10-11 | 354398 |
| 2017-10-10 | 249406 |
| 2017-10-09 | 459502 |
| 2017-10-08 | 324688 |
| 2017-10-07 | 472397 |
| 2017-10-06 | 289697 |
| 2017-10-05 | 471273 |
| 2017-10-04 | 401057 |
| 2017-10-03 | 340318 |
| 2017-10-02 | 370769 |
| 2017-10-01 | 295714 |
| 2017-09-30 | 449652 |
| 2017-09-29 | 430268 |
| 2017-09-28 | 271370 |
| 2017-09-27 | 462550 |
| 2017-09-26 | 372131 |
| 2017-09-25 | 449468 |
| 2017-09-24 | 267428 |
| 2017-09-23 | 281902 |
| 2017-09-22 | 220590 |
| 2017-09-21 | 309598 |
| 2017-09-20 | 318542 |
| 2017-09-19 | 326429 |
| 2017-09-18 | 276837 |
| 2017-09-17 | 492200 |
| 2017-09-16 | 290996 |
| 2017-09-15 | 273913 |
| 2017-09-14 | 474941 |
| 2017-09-13 | 211933 |
| 2017-09-12 | 278105 |
| 2017-09-11 | 495290 |
| 2017-09-10 | 331948 |
| 2017-09-09 | 280072 |
| 2017-09-08 | 273770 |
| 2017-09-07 | 299224 |
| 2017-09-06 | 424281 |
| 2017-09-05 | 207291 |
| 2017-09-04 | 321237 |
| 2017-09-03 | 213949 |
| 2017-09-02 | 364923 |
| 2017-09-01 | 338009 |
| 2017-08-31 | 203033 |
| 2017-08-30 | 219724 |
| 2017-08-29 | 441065 |
| 2017-08-28 | 334941 |
| 2017-08-27 | 456915 |
| 2017-08-26 | 325977 |
| 2017-08-25 | 434720 |
| 2017-08-24 | 409981 |
| 2017-08-23 | 259945 |
| 2017-08-22 | 241597 |
| 2017-08-21 | 290590 |
| 2017-08-20 | 397579 |
| 2017-08-19 | 435662 |
| 2017-08-18 | 279664 |
| 2017-08-17 | 215956 |
| 2017-08-16 | 302454 |
| 2017-08-15 | 448575 |
| 2017-08-14 | 345134 |
| 2017-08-13 | 272169 |
| 2017-08-12 | 207052 |
| 2017-08-11 | 349282 |
| 2017-08-10 | 311523 |
| 2017-08-09 | 376556 |
| 2017-08-08 | 276572 |
| 2017-08-07 | 308812 |
| 2017-08-06 | 317791 |
| 2017-08-05 | 438064 |
| 2017-08-04 | 280818 |
| 2017-08-03 | 422779 |
| 2017-08-02 | 433631 |
| 2017-08-01 | 233134 |
| 2017-07-31 | 431283 |
| 2017-07-30 | 304252 |
| 2017-07-29 | 343098 |
| 2017-07-28 | 395886 |
| 2017-07-27 | 229068 |
| 2017-07-26 | 419123 |
| 2017-07-25 | 412338 |
| 2017-07-24 | 400553 |
| 2017-07-23 | 251492 |
| 2017-07-22 | 402638 |
| 2017-07-21 | 221283 |
| 2017-07-20 | 224538 |
| 2017-07-19 | 254988 |
| 2017-07-18 | 273286 |
| 2017-07-17 | 298468 |
| 2017-07-16 | 304288 |
| 2017-07-15 | 400348 |
| 2017-07-14 | 314433 |
| 2017-07-13 | 335403 |
| 2017-07-12 | 399902 |
| 2017-07-11 | 345844 |
| 2017-07-10 | 360115 |
| 2017-07-09 | 292463 |
| 2017-07-08 | 422524 |
| 2017-07-07 | 444898 |
| 2017-07-06 | 343929 |
| 2017-07-05 | 217036 |
| 2017-07-04 | 471097 |
| 2017-07-03 | 345602 |
| 2017-07-02 | 425462 |
| 2017-07-01 | 318721 |
| 2017-06-30 | 443287 |
| 2017-06-29 | 330010 |
| 2017-06-28 | 214011 |
| 2017-06-27 | 401907 |
| 2017-06-26 | 347076 |
| 2017-06-25 | 491061 |
| 2017-06-24 | 272469 |
| 2017-06-23 | 275318 |
| 2017-06-22 | 307413 |
| 2017-06-21 | 270334 |
| 2017-06-20 | 415581 |
| 2017-06-19 | 306942 |
| 2017-06-18 | 207141 |
| 2017-06-17 | 350489 |
| 2017-06-16 | 255331 |
| 2017-06-15 | 280108 |
| 2017-06-14 | 365538 |
| 2017-06-13 | 366737 |
| 2017-06-12 | 355431 |
| 2017-06-11 | 454973 |
| 2017-06-10 | 364230 |
| 2017-06-09 | 489675 |
| 2017-06-08 | 443873 |
| 2017-06-07 | 397283 |
| 2017-06-06 | 272325 |
| 2017-06-05 | 231333 |
| 2017-06-04 | 413822 |
| 2017-06-03 | 203095 |
| 2017-06-02 | 220109 |
| 2017-06-01 | 216077 |
| 2017-05-31 | 425296 |
| 2017-05-30 | 389339 |
| 2017-05-29 | 214449 |
| 2017-05-28 | 213990 |
| 2017-05-27 | 358131 |
| 2017-05-26 | 262986 |
| 2017-05-25 | 346335 |
| 2017-05-24 | 358205 |
| 2017-05-23 | 422723 |
| 2017-05-22 | 417961 |
| 2017-05-21 | 242215 |
| 2017-05-20 | 217115 |
| 2017-05-19 | 413104 |
| 2017-05-18 | 342930 |
| 2017-05-17 | 378409 |
| 2017-05-16 | 463024 |
| 2017-05-15 | 345940 |
| 2017-05-14 | 428054 |
| 2017-05-13 | 351458 |
| 2017-05-12 | 463890 |
| 2017-05-11 | 474062 |
| 2017-05-10 | 233988 |
| 2017-05-09 | 490853 |
| 2017-05-08 | 325024 |
| 2017-05-07 | 337727 |
| 2017-05-06 | 355619 |
| 2017-05-05 | 488597 |
| 2017-05-04 | 227140 |
| 2017-05-03 | 325927 |
| 2017-05-02 | 355784 |
| 2017-05-01 | 307236 |
| 2017-04-30 | 306067 |
| 2017-04-29 | 405111 |
| 2017-04-28 | 241509 |
| 2017-04-27 | 392132 |
| 2017-04-26 | 359681 |
| 2017-04-25 | 319872 |
| 2017-04-24 | 467309 |
| 2017-04-23 | 381359 |
| 2017-04-22 | 425936 |
| 2017-04-21 | 389189 |
| 2017-04-20 | 357567 |
| 2017-04-19 | 429647 |
| 2017-04-18 | 238733 |
| 2017-04-17 | 215939 |
| 2017-04-16 | 214331 |
| 2017-04-15 | 364488 |
| 2017-04-14 | 413196 |
| 2017-04-13 | 397450 |
| 2017-04-12 | 237938 |
| 2017-04-11 | 468769 |
| 2017-04-10 | 480286 |
| 2017-04-09 | 273529 |
| 2017-04-08 | 283569 |
| 2017-04-07 | 472665 |
| 2017-04-06 | 409916 |
| 2017-04-05 | 420458 |
| 2017-04-04 | 402606 |
| 2017-04-03 | 241975 |
| 2017-04-02 | 280622 |
| 2017-04-01 | 273181 |
| 2017-03-31 | 465207 |
| 2017-03-30 | 439823 |
| 2017-03-29 | 399887 |
| 2017-03-28 | 287456 |
| 2017-03-27 | 404503 |
| 2017-03-26 | 238127 |
| 2017-03-25 | 492517 |
| 2017-03-24 | 377211 |
| 2017-03-23 | 490168 |
| 2017-03-22 | 422983 |
| 2017-03-21 | 429938 |
| 2017-03-20 | 262845 |
| 2017-03-19 | 436342 |
| 2017-03-18 | 201170 |
| 2017-03-17 | 245281 |
| 2017-03-16 | 383535 |
| 2017-03-15 | 460542 |
| 2017-03-14 | 209776 |
| 2017-03-13 | 313113 |
| 2017-03-12 | 385873 |
| 2017-03-11 | 323466 |
| 2017-03-10 | 248821 |
| 2017-03-09 | 341136 |
| 2017-03-08 | 296598 |
| 2017-03-07 | 389814 |
| 2017-03-06 | 248768 |
| 2017-03-05 | 438400 |
| 2017-03-04 | 381215 |
| 2017-03-03 | 396743 |
| 2017-03-02 | 335636 |
| 2017-03-01 | 435333 |
| 2017-02-28 | 305823 |
| 2017-02-27 | 432461 |
| 2017-02-26 | 370671 |
| 2017-02-25 | 210202 |
| 2017-02-24 | 213118 |
| 2017-02-23 | 453286 |
| 2017-02-22 | 397504 |
| 2017-02-21 | 394468 |
| 2017-02-20 | 452084 |
| 2017-02-19 | 268027 |
| 2017-02-18 | 389244 |
| 2017-02-17 | 229958 |
| 2017-02-16 | 490238 |
| 2017-02-15 | 301847 |
| 2017-02-14 | 226817 |
| 2017-02-13 | 292727 |
| 2017-02-12 | 291703 |
| 2017-02-11 | 479663 |
| 2017-02-10 | 294924 |
| 2017-02-09 | 391580 |
| 2017-02-08 | 498831 |
| 2017-02-07 | 449044 |
| 2017-02-06 | 450106 |
| 2017-02-05 | 467561 |
| 2017-02-04 | 365381 |
| 2017-02-03 | 415956 |
| 2017-02-02 | 332738 |
| 2017-02-01 | 212156 |
| 2017-01-31 | 469992 |
| 2017-01-30 | 459293 |
| 2017-01-29 | 272396 |
| 2017-01-28 | 205708 |
| 2017-01-27 | 269346 |
| 2017-01-26 | 265089 |
| 2017-01-25 | 486883 |
| 2017-01-24 | 405033 |
| 2017-01-23 | 328733 |
| 2017-01-22 | 438233 |
| 2017-01-21 | 467371 |
| 2017-01-20 | 453782 |
| 2017-01-19 | 410054 |
| 2017-01-18 | 396174 |
| 2017-01-17 | 388848 |
| 2017-01-16 | 305692 |
| 2017-01-15 | 482516 |
| 2017-01-14 | 273420 |
| 2017-01-13 | 229618 |
| 2017-01-12 | 302265 |
| 2017-01-11 | 474465 |
| 2017-01-10 | 213898 |
| 2017-01-09 | 486822 |
| 2017-01-08 | 467890 |
| 2017-01-07 | 365271 |
| 2017-01-06 | 268072 |
| 2017-01-05 | 381155 |
| 2017-01-04 | 239957 |
| 2017-01-03 | 340321 |
| 2017-01-02 | 227518 |
| 2017-01-01 | 211819 |
| 2016-12-31 | 262636 |
| 2016-12-30 | 300111 |
| 2016-12-29 | 467201 |
| 2016-12-28 | 334856 |
| 2016-12-27 | 397647 |
| 2016-12-26 | 499848 |
| 2016-12-25 | 212280 |
| 2016-12-24 | 338921 |
| 2016-12-23 | 420051 |
| 2016-12-22 | 379449 |
| 2016-12-21 | 411200 |
| 2016-12-20 | 386004 |
| 2016-12-19 | 332672 |
| 2016-12-18 | 250928 |
| 2016-12-17 | 347229 |
| 2016-12-16 | 478546 |
| 2016-12-15 | 272519 |
| 2016-12-14 | 225602 |
| 2016-12-13 | 347449 |
| 2016-12-12 | 353246 |
| 2016-12-11 | 200783 |
| 2016-12-10 | 238559 |
| 2016-12-09 | 286415 |
| 2016-12-08 | 431663 |
| 2016-12-07 | 346911 |
| 2016-12-06 | 377546 |
| 2016-12-05 | 436020 |
| 2016-12-04 | 407868 |
| 2016-12-03 | 377993 |
| 2016-12-02 | 394695 |
| 2016-12-01 | 470309 |
| 2016-11-30 | 372514 |
| 2016-11-29 | 401374 |
| 2016-11-28 | 339072 |
| 2016-11-27 | 272166 |
| 2016-11-26 | 206060 |
| 2016-11-25 | 262143 |
| 2016-11-24 | 444648 |
| 2016-11-23 | 336457 |
| 2016-11-22 | 220540 |
| 2016-11-21 | 245737 |
| 2016-11-20 | 268747 |
| 2016-11-19 | 393019 |
| 2016-11-18 | 296973 |
| 2016-11-17 | 306823 |
| 2016-11-16 | 279413 |
| 2016-11-15 | 321806 |
| 2016-11-14 | 355833 |
| 2016-11-13 | 427647 |
| 2016-11-12 | 464204 |
| 2016-11-11 | 431122 |
| 2016-11-10 | 426769 |
| 2016-11-09 | 334836 |
| 2016-11-08 | 346011 |
| 2016-11-07 | 265032 |
| 2016-11-06 | 447522 |
| 2016-11-05 | 207341 |
| 2016-11-04 | 418062 |
| 2016-11-03 | 272008 |
| 2016-11-02 | 354546 |
| 2016-11-01 | 265516 |
| 2016-10-31 | 465451 |
| 2016-10-30 | 384558 |
| 2016-10-29 | 430945 |
| 2016-10-28 | 444940 |
| 2016-10-27 | 201861 |
| 2016-10-26 | 283162 |
| 2016-10-25 | 273786 |
| 2016-10-24 | 336593 |
| 2016-10-23 | 338596 |
| 2016-10-22 | 465962 |
| 2016-10-21 | 324260 |
| 2016-10-20 | 435644 |
| 2016-10-19 | 388180 |
| 2016-10-18 | 435074 |
| 2016-10-17 | 386937 |
| 2016-10-16 | 481251 |
| 2016-10-15 | 305310 |
| 2016-10-14 | 442191 |
| 2016-10-13 | 269722 |
| 2016-10-12 | 211950 |
| 2016-10-11 | 487611 |
| 2016-10-10 | 491610 |
| 2016-10-09 | 482617 |
| 2016-10-08 | 335700 |
| 2016-10-07 | 394944 |
| 2016-10-06 | 396021 |
| 2016-10-05 | 231707 |
| 2016-10-04 | 275584 |
| 2016-10-03 | 235830 |
| 2016-10-02 | 378311 |
| 2016-10-01 | 301151 |
| 2016-09-30 | 208775 |
| 2016-09-29 | 238220 |
| 2016-09-28 | 485807 |
| 2016-09-27 | 305644 |
| 2016-09-26 | 473285 |
| 2016-09-25 | 238225 |
| 2016-09-24 | 212481 |
| 2016-09-23 | 468555 |
| 2016-09-22 | 335042 |
| 2016-09-21 | 283029 |
| 2016-09-20 | 218791 |
| 2016-09-19 | 228469 |
| 2016-09-18 | 353489 |
| 2016-09-17 | 321902 |
| 2016-09-16 | 460351 |
| 2016-09-15 | 495979 |
| 2016-09-14 | 357994 |
| 2016-09-13 | 229635 |
| 2016-09-12 | 303604 |
| 2016-09-11 | 462045 |
| 2016-09-10 | 493203 |
| 2016-09-09 | 285045 |
| 2016-09-08 | 355163 |
| 2016-09-07 | 261688 |
| 2016-09-06 | 420486 |
| 2016-09-05 | 304431 |
| 2016-09-04 | 268079 |
| 2016-09-03 | 241054 |
| 2016-09-02 | 381053 |
| 2016-09-01 | 288290 |
| 2016-08-31 | 454257 |
| 2016-08-30 | 446170 |
| 2016-08-29 | 238597 |
| 2016-08-28 | 482074 |
| 2016-08-27 | 287850 |
| 2016-08-26 | 323115 |
| 2016-08-25 | 422726 |
| 2016-08-24 | 235596 |
| 2016-08-23 | 343601 |
| 2016-08-22 | 369847 |
| 2016-08-21 | 318621 |
| 2016-08-20 | 484433 |
| 2016-08-19 | 299595 |
| 2016-08-18 | 496471 |
| 2016-08-17 | 241783 |
| 2016-08-16 | 375353 |
| 2016-08-15 | 442655 |
| 2016-08-14 | 470788 |
| 2016-08-13 | 496308 |
| 2016-08-12 | 219859 |
| 2016-08-11 | 209140 |
| 2016-08-10 | 395905 |
| 2016-08-09 | 219419 |
| 2016-08-08 | 497139 |
| 2016-08-07 | 411003 |
| 2016-08-06 | 273803 |
| 2016-08-05 | 288611 |
| 2016-08-04 | 381650 |
| 2016-08-03 | 485173 |
| 2016-08-02 | 412617 |
| 2016-08-01 | 405569 |
| 2016-07-31 | 445131 |
| 2016-07-30 | 371591 |
| 2016-07-29 | 239213 |
| 2016-07-28 | 438540 |
| 2016-07-27 | 240062 |
| 2016-07-26 | 316159 |
| 2016-07-25 | 413084 |
| 2016-07-24 | 313994 |
| 2016-07-23 | 338418 |
| 2016-07-22 | 493467 |
| 2016-07-21 | 277053 |
| 2016-07-20 | 420229 |
| 2016-07-19 | 267495 |
| 2016-07-18 | 312896 |
| 2016-07-17 | 276622 |
| 2016-07-16 | 256993 |
| 2016-07-15 | 314769 |
| 2016-07-14 | 403991 |
| 2016-07-13 | 375465 |
| 2016-07-12 | 379622 |
| 2016-07-11 | 257639 |
| 2016-07-10 | 330760 |
| 2016-07-09 | 416202 |
| 2016-07-08 | 224380 |
| 2016-07-07 | 313389 |
| 2016-07-06 | 459610 |
| 2016-07-05 | 322142 |
| 2016-07-04 | 390010 |
| 2016-07-03 | 407195 |
| 2016-07-02 | 335918 |
| 2016-07-01 | 319303 |
| 2016-06-30 | 494886 |
| 2016-06-29 | 389387 |
| 2016-06-28 | 478657 |
| 2016-06-27 | 466794 |
| 2016-06-26 | 399279 |
| 2016-06-25 | 479217 |
| 2016-06-24 | 325505 |
| 2016-06-23 | 439365 |
| 2016-06-22 | 305043 |
| 2016-06-21 | 234110 |
| 2016-06-20 | 284013 |
| 2016-06-19 | 471748 |
| 2016-06-18 | 431935 |
| 2016-06-17 | 428367 |
| 2016-06-16 | 445194 |
| 2016-06-15 | 332718 |
| 2016-06-14 | 214403 |
| 2016-06-13 | 383925 |
| 2016-06-12 | 224876 |
| 2016-06-11 | 463330 |
| 2016-06-10 | 481312 |
| 2016-06-09 | 333994 |
| 2016-06-08 | 288203 |
| 2016-06-07 | 380487 |
| 2016-06-06 | 491586 |
| 2016-06-05 | 337424 |
| 2016-06-04 | 468264 |
| 2016-06-03 | 447992 |
| 2016-06-02 | 456054 |
| 2016-06-01 | 255354 |
| 2016-05-31 | 477123 |
| 2016-05-30 | 490591 |
| 2016-05-29 | 342659 |
| 2016-05-28 | 405608 |
| 2016-05-27 | 457949 |
| 2016-05-26 | 429098 |
| 2016-05-25 | 397870 |
| 2016-05-24 | 342790 |
| 2016-05-23 | 381274 |
| 2016-05-22 | 232196 |
| 2016-05-21 | 495196 |
| 2016-05-20 | 206376 |
| 2016-05-19 | 313137 |
| 2016-05-18 | 229661 |
| 2016-05-17 | 476087 |
| 2016-05-16 | 218113 |
| 2016-05-15 | 252025 |
| 2016-05-14 | 221006 |
| 2016-05-13 | 428056 |
| 2016-05-12 | 208019 |
| 2016-05-11 | 408030 |
| 2016-05-10 | 356328 |
| 2016-05-09 | 314494 |
| 2016-05-08 | 279185 |
| 2016-05-07 | 211232 |
| 2016-05-06 | 325767 |
| 2016-05-05 | 454900 |
| 2016-05-04 | 253105 |
| 2016-05-03 | 250604 |
| 2016-05-02 | 334984 |
| 2016-05-01 | 234837 |
| 2016-04-30 | 230240 |
| 2016-04-29 | 246526 |
| 2016-04-28 | 228109 |
| 2016-04-27 | 470476 |
| 2016-04-26 | 240267 |
| 2016-04-25 | 417252 |
| 2016-04-24 | 416211 |
| 2016-04-23 | 406932 |
| 2016-04-22 | 236130 |
| 2016-04-21 | 406537 |
| 2016-04-20 | 372963 |
| 2016-04-19 | 499344 |
| 2016-04-18 | 492589 |
| 2016-04-17 | 380646 |
| 2016-04-16 | 490794 |
| 2016-04-15 | 297864 |
| 2016-04-14 | 383911 |
| 2016-04-13 | 447499 |
| 2016-04-12 | 213094 |
| 2016-04-11 | 485511 |
| 2016-04-10 | 460250 |
| 2016-04-09 | 461469 |
| 2016-04-08 | 475311 |
| 2016-04-07 | 370180 |
| 2016-04-06 | 294778 |
| 2016-04-05 | 410922 |
| 2016-04-04 | 328922 |
| 2016-04-03 | 470201 |
| 2016-04-02 | 214979 |
| 2016-04-01 | 404315 |
| 2016-03-31 | 241640 |
| 2016-03-30 | 241326 |
| 2016-03-29 | 236468 |
| 2016-03-28 | 251851 |
| 2016-03-27 | 387486 |
| 2016-03-26 | 436700 |
| 2016-03-25 | 247594 |
| 2016-03-24 | 341066 |
| 2016-03-23 | 454372 |
| 2016-03-22 | 352243 |
| 2016-03-21 | 246784 |
| 2016-03-20 | 389459 |
| 2016-03-19 | 262019 |
| 2016-03-18 | 260555 |
| 2016-03-17 | 412587 |
| 2016-03-16 | 461815 |
| 2016-03-15 | 496536 |
| 2016-03-14 | 478447 |
| 2016-03-13 | 353095 |
| 2016-03-12 | 292693 |
| 2016-03-11 | 386316 |
| 2016-03-10 | 381783 |
| 2016-03-09 | 473310 |
| 2016-03-08 | 492662 |
| 2016-03-07 | 350852 |
| 2016-03-06 | 322827 |
| 2016-03-05 | 419920 |
| 2016-03-04 | 241660 |
| 2016-03-03 | 264993 |
| 2016-03-02 | 288528 |
| 2016-03-01 | 341344 |
| 2016-02-29 | 339307 |
| 2016-02-28 | 460022 |
| 2016-02-27 | 433142 |
| 2016-02-26 | 431341 |
| 2016-02-25 | 238820 |
| 2016-02-24 | 245402 |
| 2016-02-23 | 478948 |
| 2016-02-22 | 436881 |
| 2016-02-21 | 381759 |
| 2016-02-20 | 439766 |
| 2016-02-19 | 419203 |
| 2016-02-18 | 419434 |
| 2016-02-17 | 441037 |
| 2016-02-16 | 461225 |
| 2016-02-15 | 406924 |
| 2016-02-14 | 307335 |
| 2016-02-13 | 236386 |
| 2016-02-12 | 329313 |
| 2016-02-11 | 360112 |
| 2016-02-10 | 493856 |
| 2016-02-09 | 386791 |
| 2016-02-08 | 400386 |
| 2016-02-07 | 451981 |
| 2016-02-06 | 325400 |
| 2016-02-05 | 316640 |
| 2016-02-04 | 223598 |
| 2016-02-03 | 455329 |
| 2016-02-02 | 419545 |
| 2016-02-01 | 482895 |
| 2016-01-31 | 212936 |
| 2016-01-30 | 361828 |
| 2016-01-29 | 258579 |
| 2016-01-28 | 467125 |
| 2016-01-27 | 315864 |
| 2016-01-26 | 284790 |
| 2016-01-25 | 249504 |
| 2016-01-24 | 228712 |
| 2016-01-23 | 208573 |
| 2016-01-22 | 327620 |
| 2016-01-21 | 384440 |
| 2016-01-20 | 362880 |
| 2016-01-19 | 298292 |
| 2016-01-18 | 330395 |
| 2016-01-17 | 353577 |
| 2016-01-16 | 248866 |
| 2016-01-15 | 292279 |
| 2016-01-14 | 267102 |
| 2016-01-13 | 368216 |
| 2016-01-12 | 373812 |
| 2016-01-11 | 260442 |
| 2016-01-10 | 477149 |
| 2016-01-09 | 361437 |
| 2016-01-08 | 477700 |
| 2016-01-07 | 253856 |
| 2016-01-06 | 230308 |
| 2016-01-05 | 460793 |
| 2016-01-04 | 338655 |
| 2016-01-03 | 499127 |
| 2016-01-02 | 270548 |
| 2016-01-01 | 275674 |
| 2015-12-31 | 426682 |